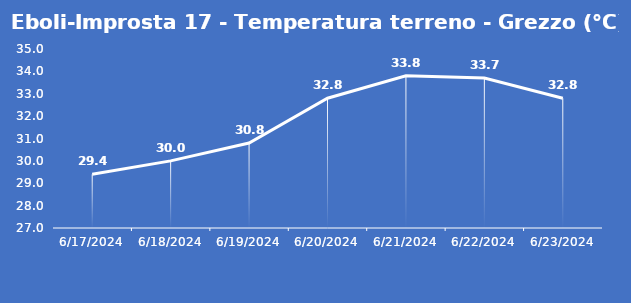
| Category | Eboli-Improsta 17 - Temperatura terreno - Grezzo (°C) |
|---|---|
| 6/17/24 | 29.4 |
| 6/18/24 | 30 |
| 6/19/24 | 30.8 |
| 6/20/24 | 32.8 |
| 6/21/24 | 33.8 |
| 6/22/24 | 33.7 |
| 6/23/24 | 32.8 |